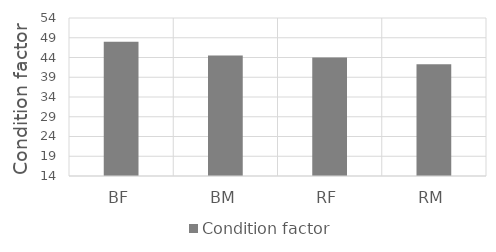
| Category | Condition factor |
|---|---|
| BF | 48 |
| BM | 44.518 |
| RF | 44 |
| RM | 42.284 |